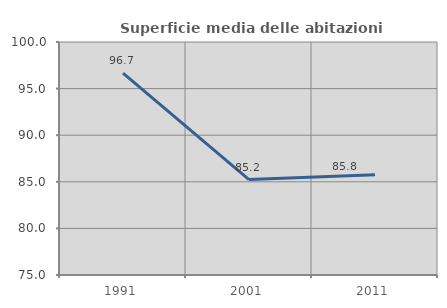
| Category | Superficie media delle abitazioni occupate |
|---|---|
| 1991.0 | 96.653 |
| 2001.0 | 85.235 |
| 2011.0 | 85.758 |